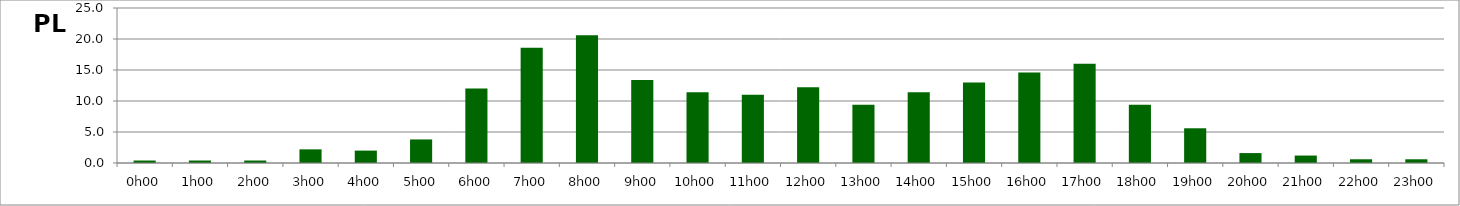
| Category | PL |
|---|---|
| 0.0 | 0.4 |
| 0.041666666666666664 | 0.4 |
| 0.08333333333333333 | 0.4 |
| 0.125 | 2.2 |
| 0.16666666666666666 | 2 |
| 0.20833333333333334 | 3.8 |
| 0.25 | 12 |
| 0.2916666666666667 | 18.6 |
| 0.3333333333333333 | 20.6 |
| 0.375 | 13.4 |
| 0.4166666666666667 | 11.4 |
| 0.4583333333333333 | 11 |
| 0.5 | 12.2 |
| 0.5416666666666666 | 9.4 |
| 0.5833333333333334 | 11.4 |
| 0.625 | 13 |
| 0.6666666666666666 | 14.6 |
| 0.7083333333333334 | 16 |
| 0.75 | 9.4 |
| 0.7916666666666666 | 5.6 |
| 0.8333333333333334 | 1.6 |
| 0.875 | 1.2 |
| 0.9166666666666666 | 0.6 |
| 0.9583333333333334 | 0.6 |